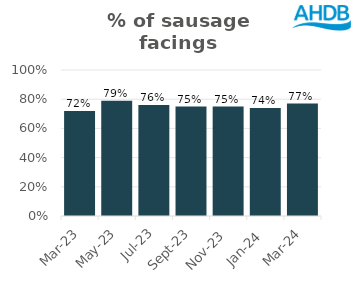
| Category | Sausage |
|---|---|
| 2023-03-01 | 0.72 |
| 2023-05-01 | 0.79 |
| 2023-07-01 | 0.76 |
| 2023-09-01 | 0.75 |
| 2023-11-01 | 0.75 |
| 2024-01-01 | 0.74 |
| 2024-03-01 | 0.77 |